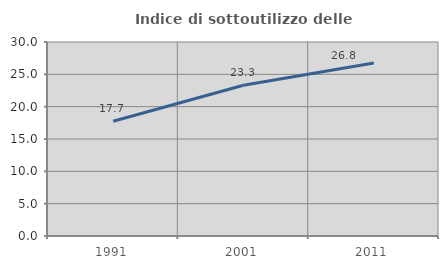
| Category | Indice di sottoutilizzo delle abitazioni  |
|---|---|
| 1991.0 | 17.739 |
| 2001.0 | 23.319 |
| 2011.0 | 26.764 |